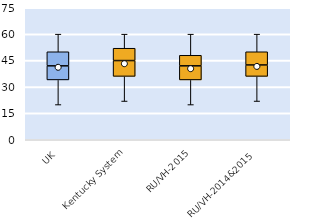
| Category | 25th | 50th | 75th |
|---|---|---|---|
| UK | 34 | 8 | 8 |
| Kentucky System | 36 | 9 | 7 |
| RU/VH-2015 | 34 | 8 | 6 |
| RU/VH-2014&2015 | 36 | 6.5 | 7.5 |